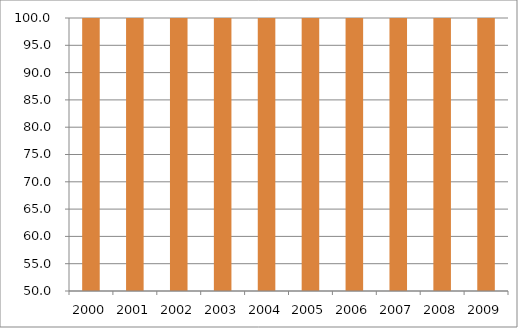
| Category | Região Centro-Oeste |
|---|---|
| 2000.0 | 110.65 |
| 2001.0 | 105.71 |
| 2002.0 | 104.21 |
| 2003.0 | 104.13 |
| 2004.0 | 105.96 |
| 2005.0 | 102.69 |
| 2006.0 | 102.57 |
| 2007.0 | 108.33 |
| 2008.0 | 102.29 |
| 2009.0 | 103.33 |